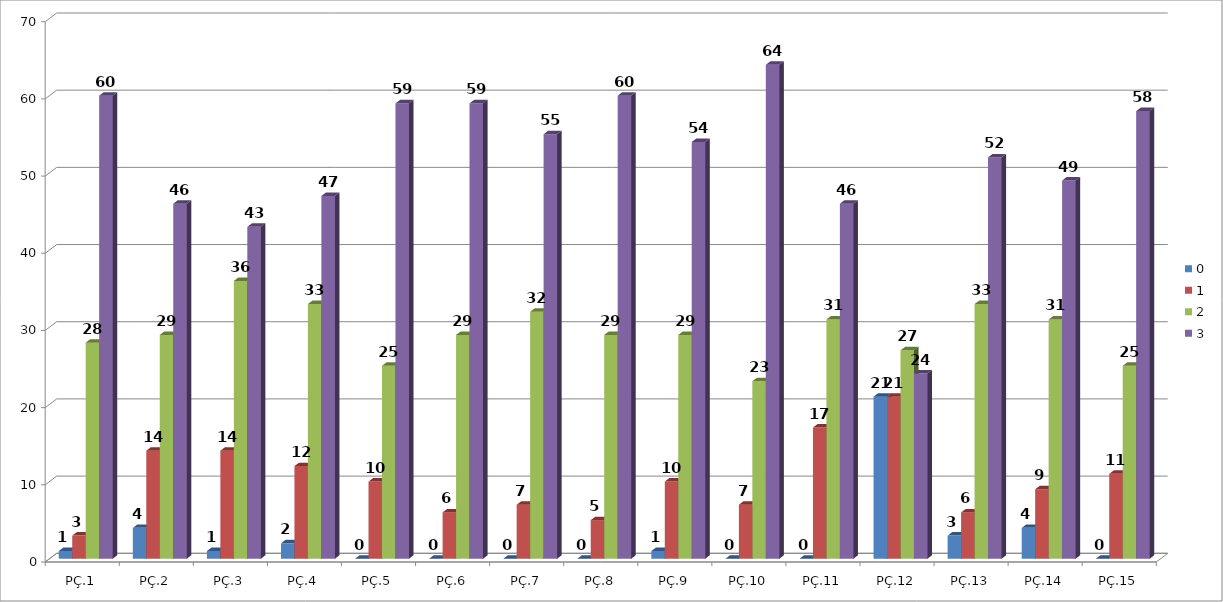
| Category | 0 | 1 | 2 | 3 |
|---|---|---|---|---|
| PÇ.1 | 1 | 3 | 28 | 60 |
| PÇ.2 | 4 | 14 | 29 | 46 |
| PÇ.3 | 1 | 14 | 36 | 43 |
| PÇ.4 | 2 | 12 | 33 | 47 |
| PÇ.5 | 0 | 10 | 25 | 59 |
| PÇ.6 | 0 | 6 | 29 | 59 |
| PÇ.7 | 0 | 7 | 32 | 55 |
| PÇ.8 | 0 | 5 | 29 | 60 |
| PÇ.9 | 1 | 10 | 29 | 54 |
| PÇ.10 | 0 | 7 | 23 | 64 |
| PÇ.11 | 0 | 17 | 31 | 46 |
| PÇ.12 | 21 | 21 | 27 | 24 |
| PÇ.13 | 3 | 6 | 33 | 52 |
| PÇ.14 | 4 | 9 | 31 | 49 |
| PÇ.15 | 0 | 11 | 25 | 58 |